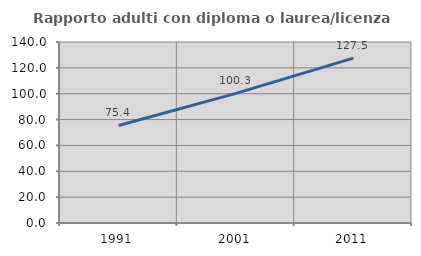
| Category | Rapporto adulti con diploma o laurea/licenza media  |
|---|---|
| 1991.0 | 75.423 |
| 2001.0 | 100.255 |
| 2011.0 | 127.506 |